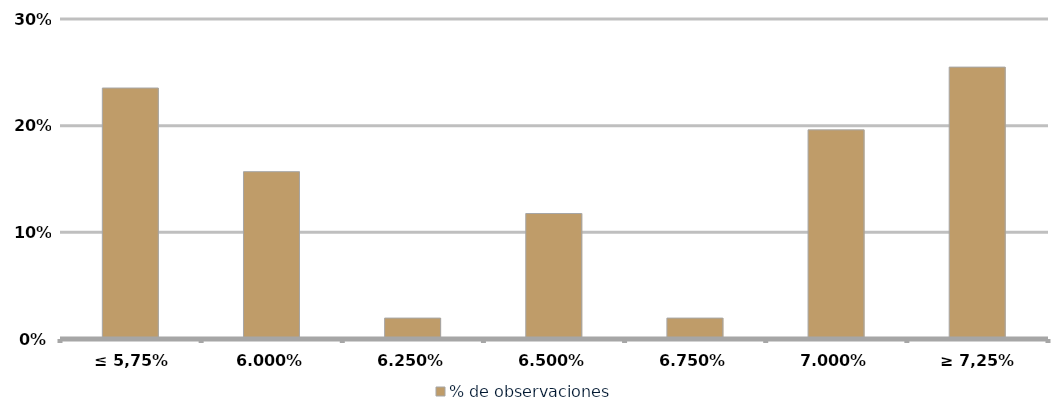
| Category | % de observaciones  |
|---|---|
| ≤ 5,75% | 0.235 |
| 6,00% | 0.157 |
| 6,25% | 0.02 |
| 6,50% | 0.118 |
| 6,75% | 0.02 |
| 7,00% | 0.196 |
| ≥ 7,25% | 0.255 |